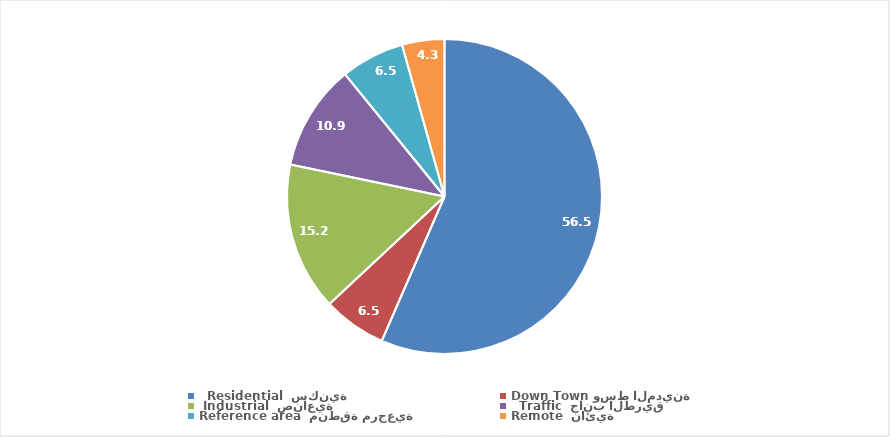
| Category | Series 0 |
|---|---|
| 0 | 56.522 |
| 1 | 6.522 |
| 2 | 15.217 |
| 3 | 10.87 |
| 4 | 6.522 |
| 5 | 4.348 |